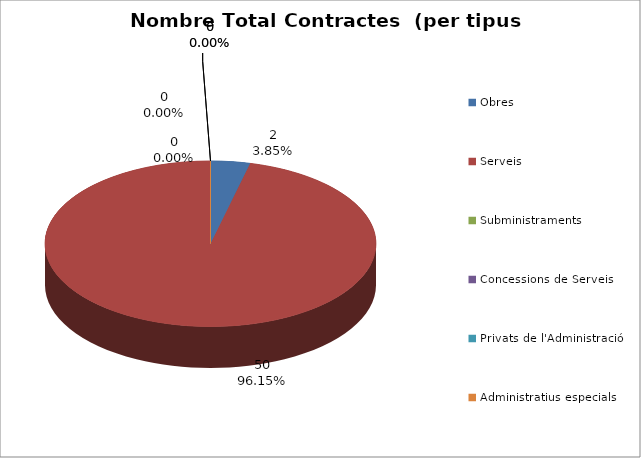
| Category | Nombre Total Contractes |
|---|---|
| Obres | 2 |
| Serveis | 50 |
| Subministraments | 0 |
| Concessions de Serveis | 0 |
| Privats de l'Administració | 0 |
| Administratius especials | 0 |